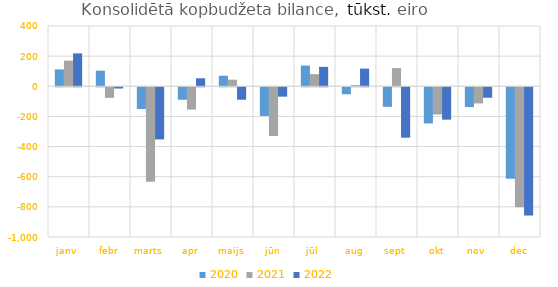
| Category | 2020 | 2021 | 2022 |
|---|---|---|---|
| janv | 111895.871 | 170157.398 | 218389.091 |
| febr | 103710.663 | -70037.902 | -8203.95 |
| marts | -144293.056 | -626307.766 | -345869.737 |
| apr | -82622.753 | -147810.305 | 53138.837 |
| maijs | 70036.276 | 43702.036 | -82553.768 |
| jūn | -190113.001 | -323251.437 | -61976.694 |
| jūl | 137554.965 | 80650.706 | 128860.015 |
| aug | -46323.774 | 8217.929 | 117341.161 |
| sept | -129953.415 | 120460.062 | -334219.509 |
| okt | -239787.453 | -180467.443 | -214870.466 |
| nov | -131403.441 | -107114.455 | -69420.277 |
| dec | -607594.717 | -796518.828 | -851302.945 |